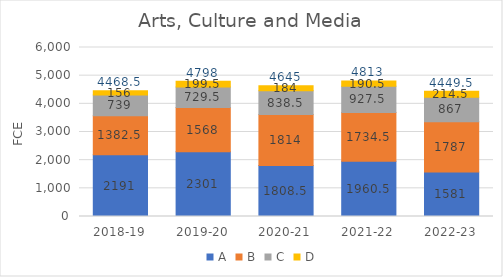
| Category | A | B | C | D |
|---|---|---|---|---|
| 2018-19 | 2191 | 1382.5 | 739 | 156 |
| 2019-20 | 2301 | 1568 | 729.5 | 199.5 |
| 2020-21 | 1808.5 | 1814 | 838.5 | 184 |
| 2021-22 | 1960.5 | 1734.5 | 927.5 | 190.5 |
| 2022-23 | 1581 | 1787 | 867 | 214.5 |